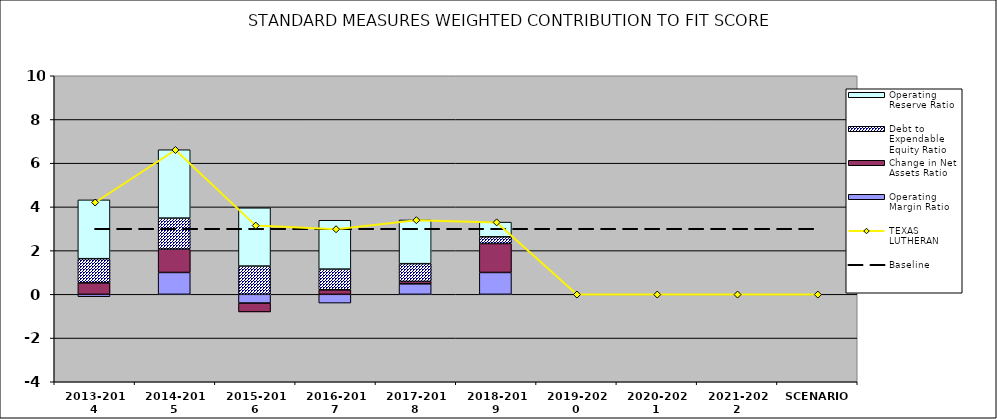
| Category | Operating Margin Ratio | Change in Net Assets Ratio | Debt to Expendable Equity Ratio | Operating Reserve Ratio |
|---|---|---|---|---|
| 2013-2014 | -0.109 | 0.526 | 1.105 | 2.69 |
| 2014-2015 | 1 | 1.069 | 1.418 | 3.128 |
| 2015-2016 | -0.4 | -0.404 | 1.292 | 2.666 |
| 2016-2017 | -0.4 | 0.205 | 0.948 | 2.235 |
| 2017-2018 | 0.481 | 0.112 | 0.81 | 2 |
| 2018-2019 | 1 | 1.324 | 0.307 | 0.672 |
| 2019-2020 | 0 | 0 | 0 | 0 |
| 2020-2021 | 0 | 0 | 0 | 0 |
| 2021-2022 | 0 | 0 | 0 | 0 |
| SCENARIO | 0 | 0 | 0 | 0 |